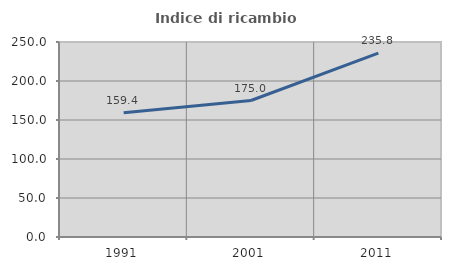
| Category | Indice di ricambio occupazionale  |
|---|---|
| 1991.0 | 159.375 |
| 2001.0 | 175 |
| 2011.0 | 235.821 |